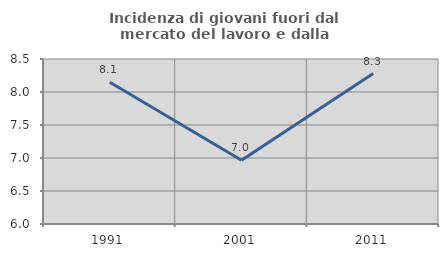
| Category | Incidenza di giovani fuori dal mercato del lavoro e dalla formazione  |
|---|---|
| 1991.0 | 8.149 |
| 2001.0 | 6.966 |
| 2011.0 | 8.28 |